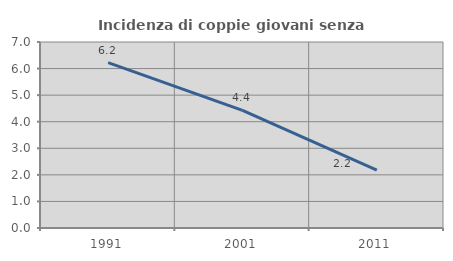
| Category | Incidenza di coppie giovani senza figli |
|---|---|
| 1991.0 | 6.223 |
| 2001.0 | 4.426 |
| 2011.0 | 2.177 |